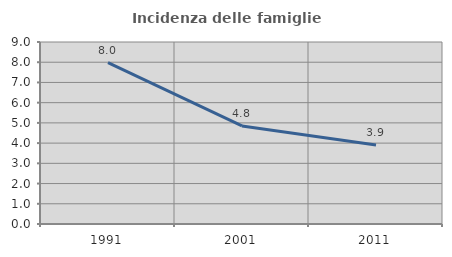
| Category | Incidenza delle famiglie numerose |
|---|---|
| 1991.0 | 7.979 |
| 2001.0 | 4.848 |
| 2011.0 | 3.908 |